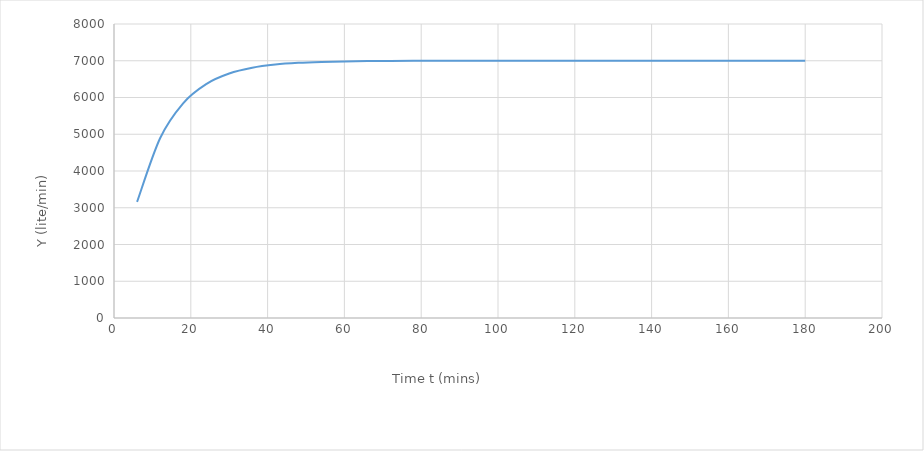
| Category | Series 0 |
|---|---|
| 6.0 | 3158.319 |
| 12.0 | 4891.641 |
| 18.0 | 5842.908 |
| 24.0 | 6364.974 |
| 30.0 | 6651.491 |
| 36.0 | 6808.734 |
| 42.0 | 6895.031 |
| 48.0 | 6942.392 |
| 54.0 | 6968.384 |
| 60.0 | 6982.649 |
| 66.0 | 6990.477 |
| 72.0 | 6994.774 |
| 78.0 | 6997.132 |
| 84.0 | 6998.426 |
| 90.0 | 6999.136 |
| 96.0 | 6999.526 |
| 102.0 | 6999.74 |
| 108.0 | 6999.857 |
| 114.0 | 6999.922 |
| 120.0 | 6999.957 |
| 126.0 | 6999.976 |
| 132.0 | 6999.987 |
| 138.0 | 6999.993 |
| 144.0 | 6999.996 |
| 150.0 | 6999.998 |
| 156.0 | 6999.999 |
| 162.0 | 6999.999 |
| 168.0 | 7000 |
| 174.0 | 7000 |
| 180.0 | 7000 |